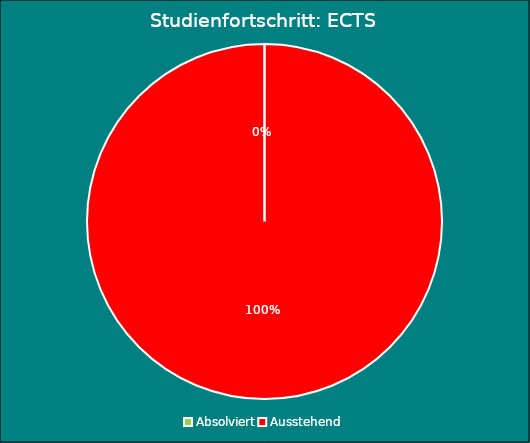
| Category | ECTS |
|---|---|
| Absolviert | 0 |
| Ausstehend | 210 |